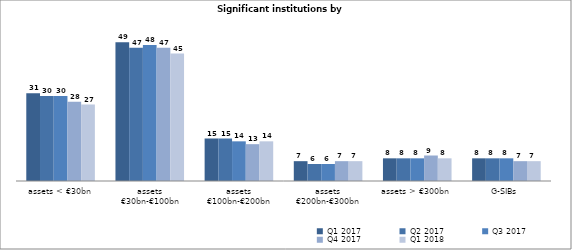
| Category | Q1 2017 | Q2 2017 | Q3 2017 | Q4 2017 | Q1 2018 |
|---|---|---|---|---|---|
| assets < €30bn | 31 | 30 | 30 | 28 | 27 |
| assets
€30bn-€100bn | 49 | 47 | 48 | 47 | 45 |
| assets
€100bn-€200bn | 15 | 15 | 14 | 13 | 14 |
| assets
€200bn-€300bn | 7 | 6 | 6 | 7 | 7 |
| assets > €300bn | 8 | 8 | 8 | 9 | 8 |
| G-SIBs | 8 | 8 | 8 | 7 | 7 |